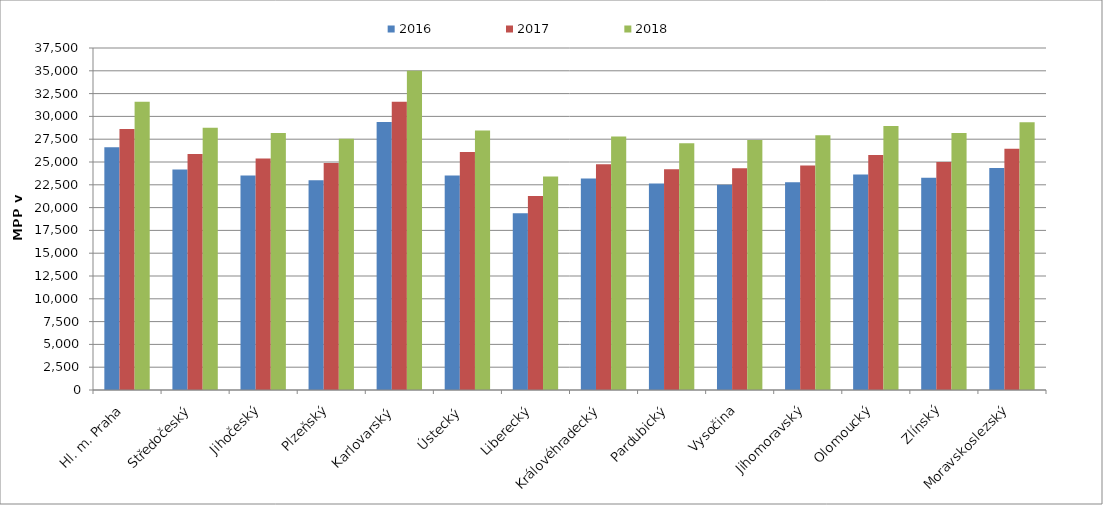
| Category | 2016 | 2017 | 2018 |
|---|---|---|---|
| Hl. m. Praha | 26627.02 | 28620.357 | 31600.087 |
| Středočeský | 24182.525 | 25887.927 | 28766.531 |
| Jihočeský | 23524.011 | 25377.881 | 28169.843 |
| Plzeňský | 22993.122 | 24884.08 | 27547.071 |
| Karlovarský  | 29394.495 | 31596.33 | 35009.174 |
| Ústecký   | 23532.218 | 26102.283 | 28451.142 |
| Liberecký | 19367.222 | 21274.302 | 23415.92 |
| Královéhradecký | 23196.414 | 24742.779 | 27791.472 |
| Pardubický | 22649.131 | 24210.108 | 27064.62 |
| Vysočina | 22505.792 | 24306.483 | 27417.655 |
| Jihomoravský | 22789.315 | 24609.972 | 27929.086 |
| Olomoucký | 23632.818 | 25766.191 | 28935.234 |
| Zlínský | 23280.042 | 24991.095 | 28187.965 |
| Moravskoslezský | 24337.154 | 26456.807 | 29356.766 |